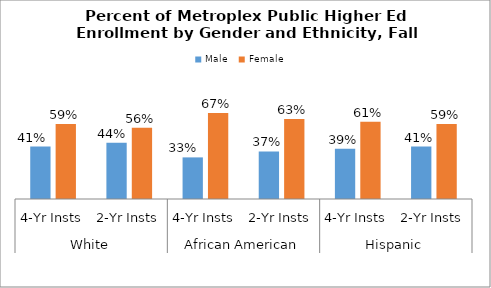
| Category | Male | Female |
|---|---|---|
| 0 | 0.411 | 0.589 |
| 1 | 0.442 | 0.558 |
| 2 | 0.326 | 0.674 |
| 3 | 0.373 | 0.627 |
| 4 | 0.393 | 0.607 |
| 5 | 0.412 | 0.588 |